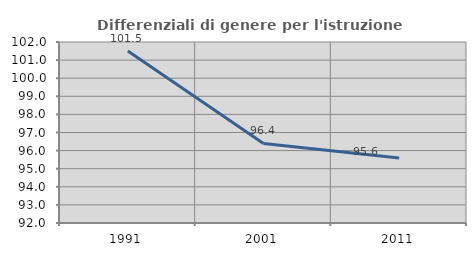
| Category | Differenziali di genere per l'istruzione superiore |
|---|---|
| 1991.0 | 101.498 |
| 2001.0 | 96.393 |
| 2011.0 | 95.59 |